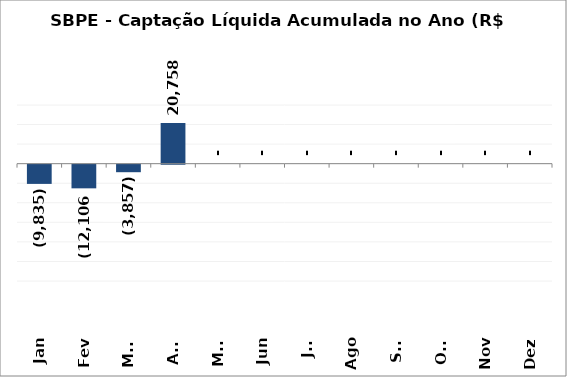
| Category | SBPE - Captação Líquida Acumulada no Ano (R$ Milhões) 2020 |
|---|---|
| Jan | -9835.145 |
| Fev | -12105.725 |
| Mar | -3856.755 |
| Abr | 20757.76 |
| Mai | 0 |
| Jun | 0 |
| Jul | 0 |
| Ago | 0 |
| Set | 0 |
| Out | 0 |
| Nov | 0 |
| Dez | 0 |